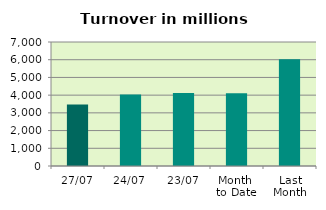
| Category | Series 0 |
|---|---|
| 27/07 | 3477.854 |
| 24/07 | 4039.445 |
| 23/07 | 4114.763 |
| Month 
to Date | 4100.905 |
| Last
Month | 6026.772 |